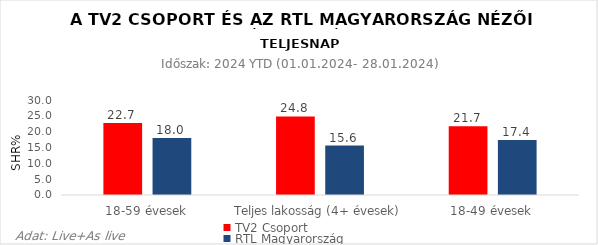
| Category | TV2 Csoport | RTL Magyarország |
|---|---|---|
| 18-59 évesek | 22.7 | 18 |
| Teljes lakosság (4+ évesek) | 24.8 | 15.6 |
| 18-49 évesek | 21.7 | 17.4 |